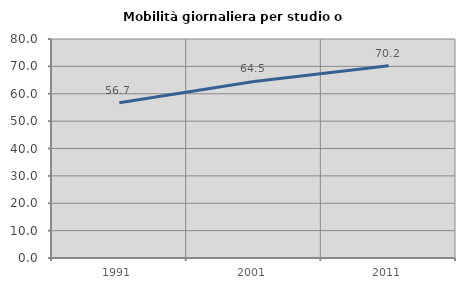
| Category | Mobilità giornaliera per studio o lavoro |
|---|---|
| 1991.0 | 56.676 |
| 2001.0 | 64.511 |
| 2011.0 | 70.237 |